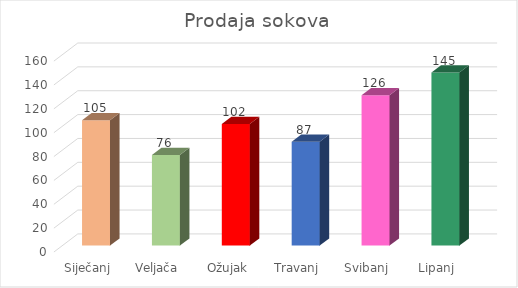
| Category | Series 0 |
|---|---|
| Siječanj | 105 |
| Veljača | 76 |
| Ožujak | 102 |
| Travanj | 87 |
| Svibanj | 126 |
| Lipanj | 145 |